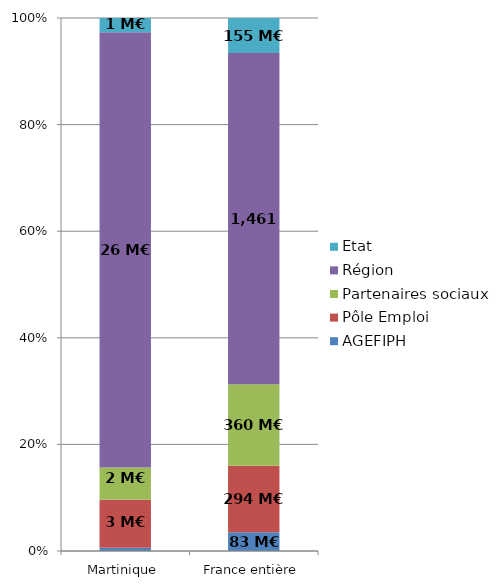
| Category | AGEFIPH | Pôle Emploi | Partenaires sociaux | Région | Etat |
|---|---|---|---|---|---|
| Martinique | 0.189 | 2.861 | 1.917 | 25.864 | 0.844 |
| France entière | 82.716 | 293.959 | 359.593 | 1461.057 | 154.74 |